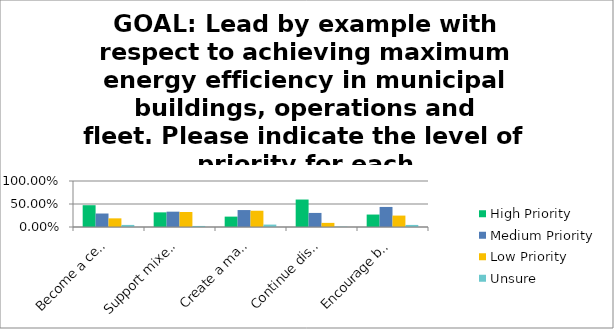
| Category | High Priority | Medium Priority | Low Priority | Unsure |
|---|---|---|---|---|
| Become a certified Green Community (learn more here) which includes energy efficiency audits at all municipal buildings and infrastructure and implementation of work to reduce energy use (paid for by the state). | 0.474 | 0.293 | 0.188 | 0.045 |
| Support mixed-use housing development where appropriate and in accordance with the neighborhood character, not to detract from the local economy or amenities. | 0.318 | 0.333 | 0.326 | 0.023 |
| Create a manual for each building/department that is continually updated. | 0.226 | 0.368 | 0.353 | 0.053 |
| Continue discussions with National Grid on resiliency and responsiveness. | 0.597 | 0.306 | 0.09 | 0.008 |
| Encourage businesses to practice good maintenance policies for their back-up generators and to institute emergency plans, using Town policy as a model. | 0.271 | 0.436 | 0.248 | 0.045 |